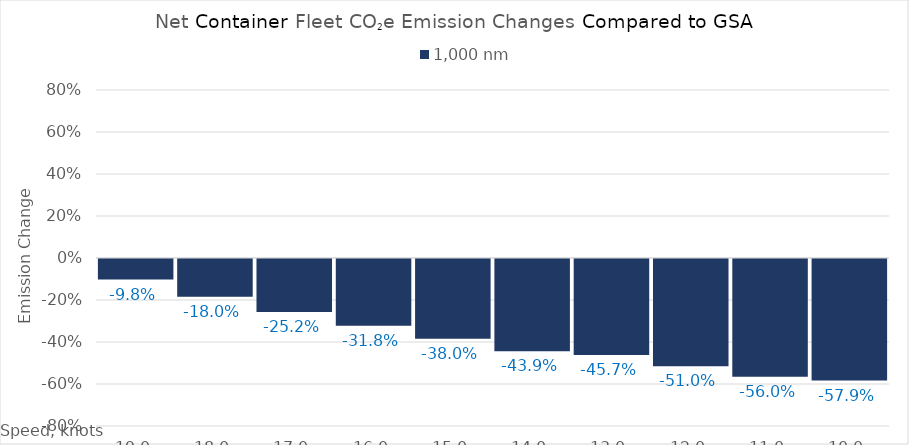
| Category | 1,000 |
|---|---|
| 19.0 | -0.098 |
| 18.0 | -0.18 |
| 17.0 | -0.252 |
| 16.0 | -0.318 |
| 15.0 | -0.38 |
| 14.0 | -0.439 |
| 13.0 | -0.457 |
| 12.0 | -0.51 |
| 11.0 | -0.56 |
| 10.0 | -0.579 |